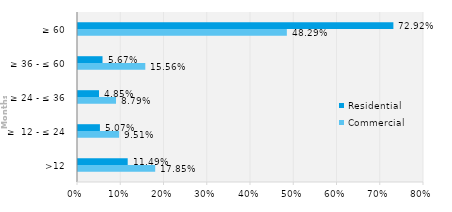
| Category | Commercial | Residential |
|---|---|---|
| >12 | 0.178 | 0.115 |
| ≥  12 - ≤ 24 | 0.095 | 0.051 |
| ≥ 24 - ≤ 36 | 0.088 | 0.048 |
| ≥ 36 - ≤ 60 | 0.156 | 0.057 |
| ≥ 60 | 0.483 | 0.729 |